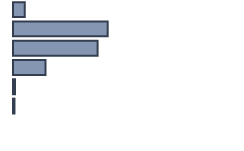
| Category | Series 0 |
|---|---|
| 0 | 5.158 |
| 1 | 41.71 |
| 2 | 37.263 |
| 3 | 14.291 |
| 4 | 0.928 |
| 5 | 0.65 |
| 6 | 0 |